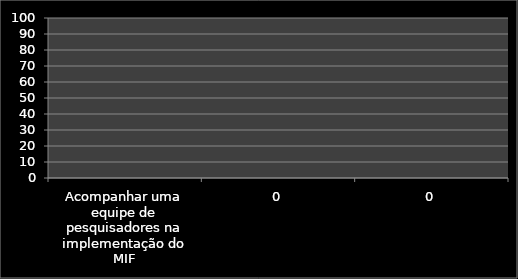
| Category | Inicio % | % |
|---|---|---|
| Acompanhar uma equipe de pesquisadores na implementação do MIF | 0 | 0 |
| 0 | 0 | 0 |
| 0 | 0 | 0 |